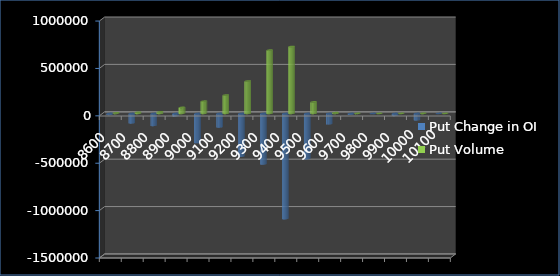
| Category | Put Change in OI | Put Volume |
|---|---|---|
| 8600.0 | -10125 | 6416 |
| 8700.0 | -99600 | 12664 |
| 8800.0 | -126300 | 16809 |
| 8900.0 | -26100 | 63717 |
| 9000.0 | -307725 | 129201 |
| 9100.0 | -142575 | 194032 |
| 9200.0 | -451575 | 342099 |
| 9300.0 | -533175 | 668026 |
| 9400.0 | -1110225 | 706199 |
| 9500.0 | -477000 | 121726 |
| 9600.0 | -109500 | 8603 |
| 9700.0 | -8325 | 720 |
| 9800.0 | -1500 | 95 |
| 9900.0 | -20925 | 454 |
| 10000.0 | -67875 | 1524 |
| 10100.0 | 0 | 0 |